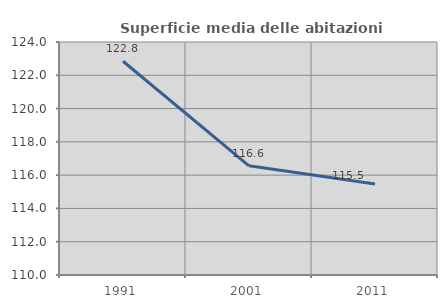
| Category | Superficie media delle abitazioni occupate |
|---|---|
| 1991.0 | 122.845 |
| 2001.0 | 116.558 |
| 2011.0 | 115.472 |